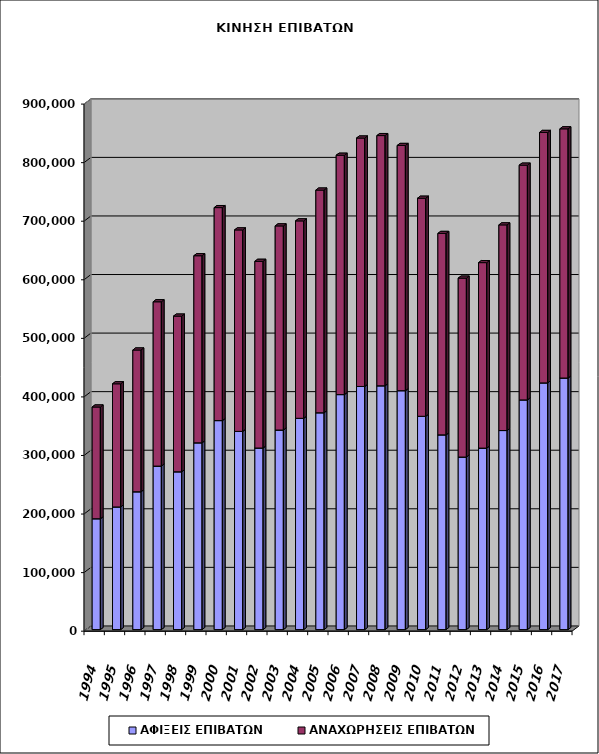
| Category | ΑΦΙΞΕΙΣ ΕΠΙΒΑΤΩΝ | ΑΝΑΧΩΡΗΣΕΙΣ ΕΠΙΒΑΤΩΝ |
|---|---|---|
| 1994.0 | 189277 | 190795 |
| 1995.0 | 209455 | 210246 |
| 1996.0 | 235325 | 242071 |
| 1997.0 | 279199 | 280569 |
| 1998.0 | 269461 | 265823 |
| 1999.0 | 318930 | 319459 |
| 2000.0 | 356883 | 363677 |
| 2001.0 | 338430 | 344039 |
| 2002.0 | 310074 | 318763 |
| 2003.0 | 340760 | 348555 |
| 2004.0 | 360778 | 337095 |
| 2005.0 | 370263 | 380213 |
| 2006.0 | 401280 | 408685 |
| 2007.0 | 415166 | 424160 |
| 2008.0 | 416295 | 427234 |
| 2009.0 | 407960 | 418717 |
| 2010.0 | 364260 | 372306 |
| 2011.0 | 332505 | 343958 |
| 2012.0 | 294635 | 305532 |
| 2013.0 | 309895 | 316699 |
| 2014.0 | 339902 | 351138 |
| 2015.0 | 392224 | 400801 |
| 2016.0 | 421257 | 427621 |
| 2017.0 | 429578 | 425472 |